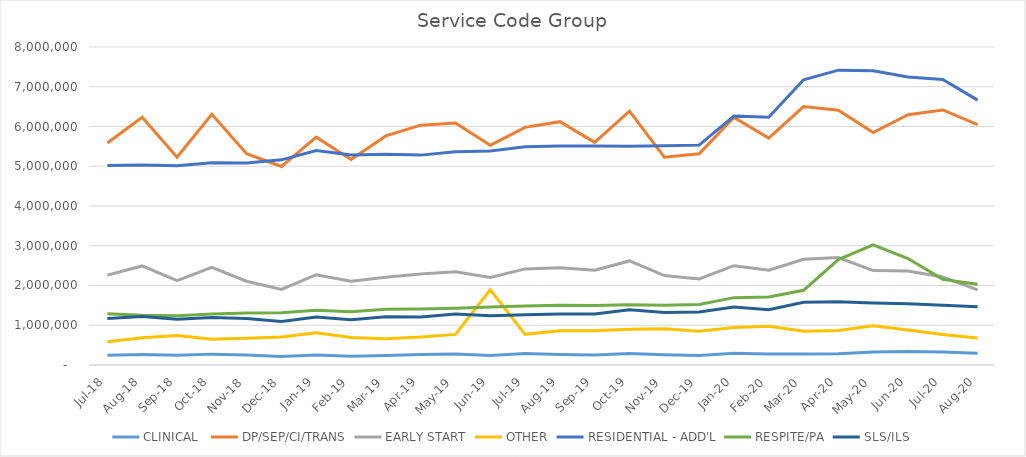
| Category | CLINICAL  | DP/SEP/CI/TRANS | EARLY START | OTHER | RESIDENTIAL - ADD'L | RESPITE/PA | SLS/ILS |
|---|---|---|---|---|---|---|---|
| Jul-18 | 247946.68 | 5583772.79 | 2259837.86 | 587629.41 | 5016934.99 | 1288005.04 | 1168030.07 |
| Aug-18 | 265357.97 | 6229778.61 | 2491816.76 | 684318.3 | 5030127.7 | 1254480.1 | 1221249.66 |
| Sep-18 | 242460.76 | 5226203.86 | 2124002.98 | 743954.38 | 5012126.05 | 1241468.52 | 1153661.76 |
| Oct-18 | 273562.73 | 6305394.85 | 2457818.81 | 645907.75 | 5085632.35 | 1285632.83 | 1194630.77 |
| Nov-18 | 249595.16 | 5315840.45 | 2107970.47 | 673997 | 5079134.56 | 1306768.2 | 1169910.2 |
| Dec-18 | 212538.38 | 4994927.46 | 1901194.84 | 703730.94 | 5161123.78 | 1316077.65 | 1095259.76 |
| Jan-19 | 252299.49 | 5730354.54 | 2271044.66 | 809324.42 | 5393052.09 | 1374336.37 | 1204318.48 |
| Feb-19 | 223223.5 | 5168300.89 | 2109669.83 | 692414.58 | 5283539.46 | 1337995.54 | 1140298.81 |
| Mar-19 | 240160.39 | 5763280.54 | 2205544.56 | 662566.59 | 5304563.67 | 1403291.24 | 1212503.45 |
| Apr-19 | 266166.29 | 6033183.96 | 2289362.17 | 702569.49 | 5280040.93 | 1409535.14 | 1206935.78 |
| May-19 | 277292.98 | 6085436.32 | 2344617.31 | 769889.76 | 5365439.4 | 1429502.81 | 1285616.03 |
| Jun-19 | 236343.96 | 5525578.46 | 2200228.59 | 1891952.32 | 5385938.22 | 1461638.09 | 1241769.14 |
| Jul-19 | 289822.9 | 5977944.77 | 2418086.06 | 770920.86 | 5487566.35 | 1481590.7 | 1266711.35 |
| Aug-19 | 263467.2 | 6120941.28 | 2446008.61 | 861081.67 | 5509821.24 | 1506072.02 | 1284528.18 |
| Sep-19 | 252520.67 | 5600566.95 | 2385777.17 | 860938.11 | 5507846.09 | 1494394.28 | 1285937.5 |
| Oct-19 | 287012.2 | 6387375.88 | 2617685.65 | 897090.85 | 5500020.39 | 1516228.9 | 1390854.56 |
| Nov-19 | 257915.96 | 5227343.94 | 2250603.51 | 913567.28 | 5516381.45 | 1505371.93 | 1323323.94 |
| Dec-19 | 240307.32 | 5312423.62 | 2164601.18 | 850120.11 | 5531329.87 | 1523872.61 | 1330763.02 |
| Jan-20 | 295278.84 | 6228070.96 | 2498083.28 | 942804.85 | 6261006.75 | 1694490.25 | 1461634.59 |
| Feb-20 | 274269.74 | 5708485 | 2382471.16 | 974922.88 | 6231097.44 | 1709475.36 | 1392953.15 |
| Mar-20 | 278893.54 | 6500563.8 | 2660793.64 | 847559.63 | 7177049.66 | 1878663.05 | 1580710.62 |
| Apr-20 | 284003.96 | 6411519.79 | 2701518.25 | 867373.15 | 7417006.64 | 2653238.1 | 1588385.03 |
| May-20 | 330060.98 | 5846922.78 | 2374490.11 | 988873.92 | 7399499.44 | 3022318.15 | 1561513.11 |
| Jun-20 | 340336.54 | 6294826.02 | 2363124.55 | 882698.33 | 7243517.52 | 2679351.7 | 1543061.93 |
| Jul-20 | 324644.44 | 6416822.08 | 2212251.15 | 766002.98 | 7182871.81 | 2154113.54 | 1502177.33 |
| Aug-20 | 295726.04 | 6045265.16 | 1889221.71 | 681517.65 | 6664013.63 | 2033960.41 | 1464340.8 |